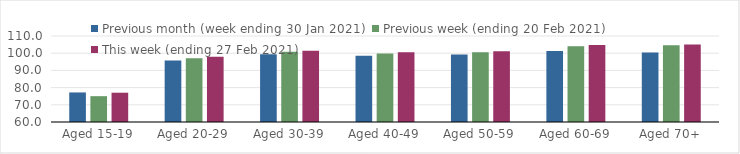
| Category | Previous month (week ending 30 Jan 2021) | Previous week (ending 20 Feb 2021) | This week (ending 27 Feb 2021) |
|---|---|---|---|
| Aged 15-19 | 77.18 | 75.02 | 77.03 |
| Aged 20-29 | 95.73 | 97.09 | 97.96 |
| Aged 30-39 | 99.46 | 100.85 | 101.41 |
| Aged 40-49 | 98.57 | 99.87 | 100.52 |
| Aged 50-59 | 99.26 | 100.59 | 101.19 |
| Aged 60-69 | 101.26 | 104.05 | 104.79 |
| Aged 70+ | 100.42 | 104.55 | 105.03 |